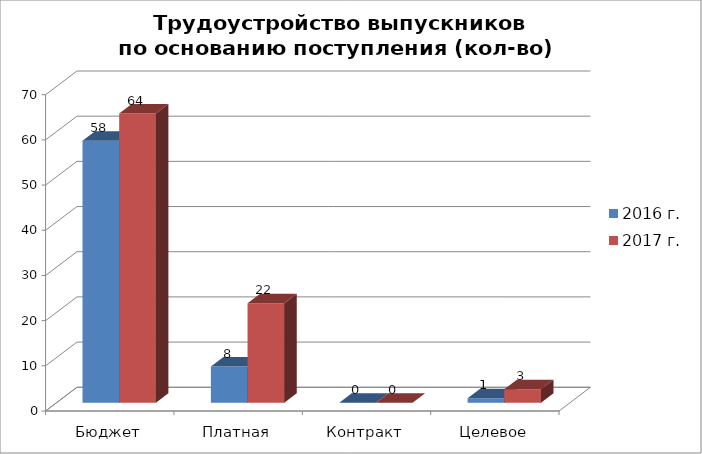
| Category | 2016 г. | 2017 г. |
|---|---|---|
| Бюджет | 58 | 64 |
| Платная | 8 | 22 |
| Контракт | 0 | 0 |
| Целевое | 1 | 3 |